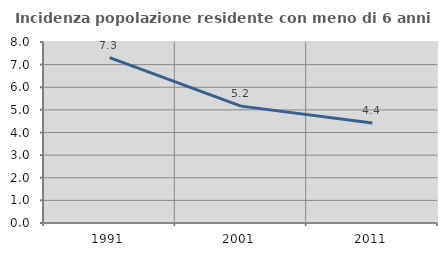
| Category | Incidenza popolazione residente con meno di 6 anni |
|---|---|
| 1991.0 | 7.306 |
| 2001.0 | 5.165 |
| 2011.0 | 4.421 |